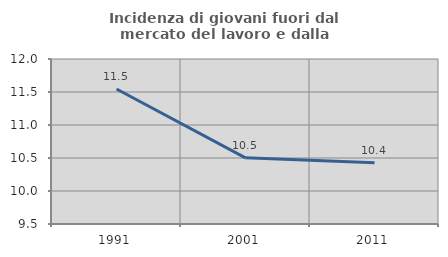
| Category | Incidenza di giovani fuori dal mercato del lavoro e dalla formazione  |
|---|---|
| 1991.0 | 11.546 |
| 2001.0 | 10.502 |
| 2011.0 | 10.428 |